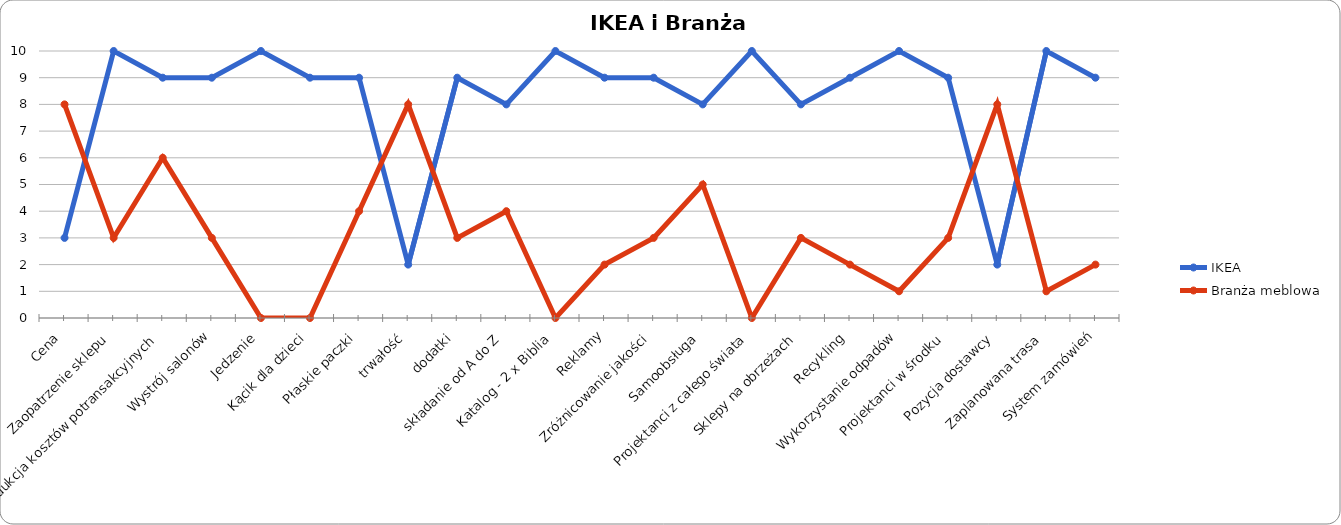
| Category | IKEA | Branża meblowa |
|---|---|---|
| Cena | 3 | 8 |
| Zaopatrzenie sklepu | 10 | 3 |
| Redukcja kosztów potransakcyjnych | 9 | 6 |
| Wystrój salonów | 9 | 3 |
| Jedzenie | 10 | 0 |
| Kącik dla dzieci | 9 | 0 |
| Płaskie paczki | 9 | 4 |
| trwałość | 2 | 8 |
| dodatki | 9 | 3 |
| składanie od A do Z | 8 | 4 |
| Katalog - 2 x Biblia | 10 | 0 |
| Reklamy | 9 | 2 |
| Zróżnicowanie jakości | 9 | 3 |
| Samoobsługa | 8 | 5 |
| Projektanci z całego świata | 10 | 0 |
| Sklepy na obrzeżach | 8 | 3 |
| Recykling | 9 | 2 |
| Wykorzystanie odpadów | 10 | 1 |
| Projektanci w środku | 9 | 3 |
| Pozycja dostawcy | 2 | 8 |
| Zaplanowana trasa | 10 | 1 |
| System zamówień | 9 | 2 |